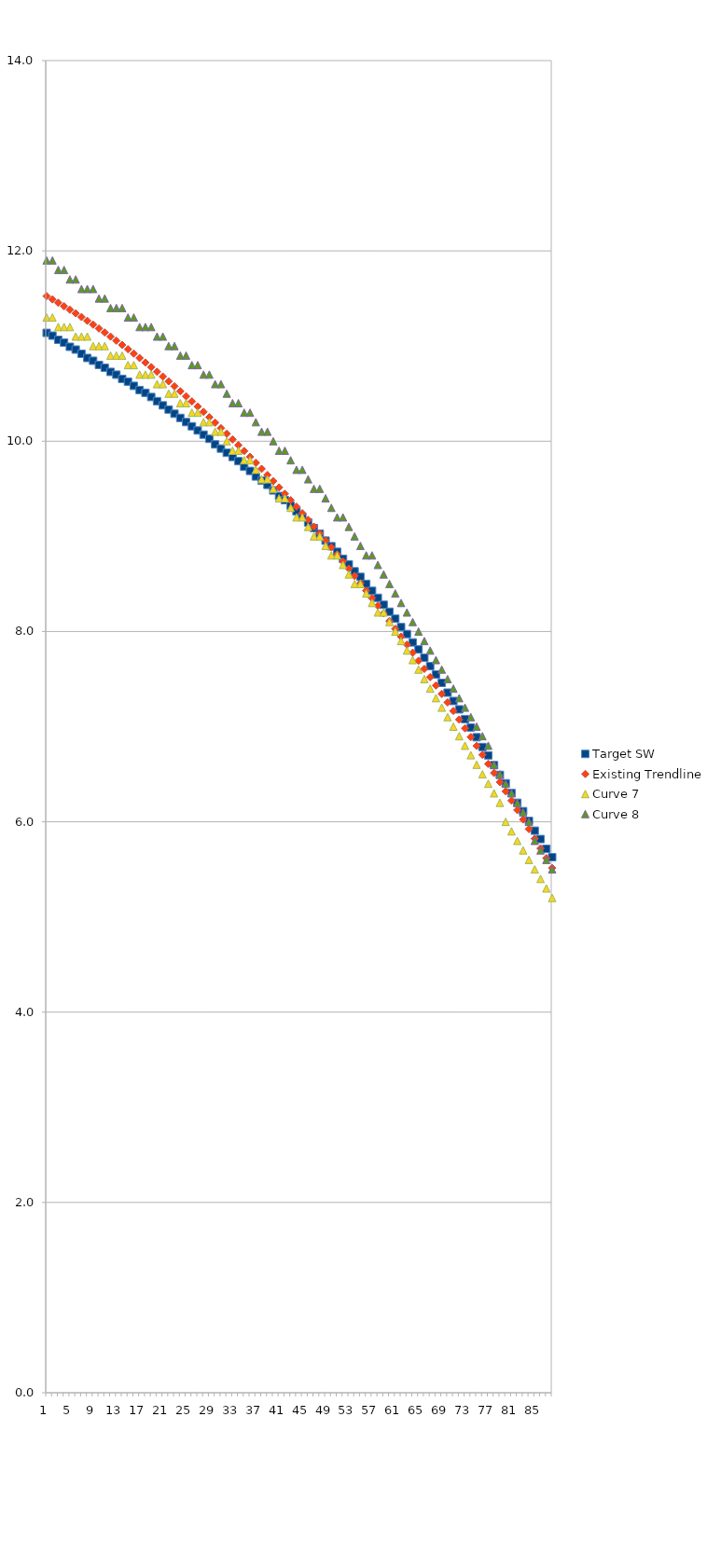
| Category | Target SW | Existing Trendline | Curve 7 | Curve 8 |
|---|---|---|---|---|
| 0 | 11.139 | 11.525 | 11.3 | 11.9 |
| 1 | 11.109 | 11.49 | 11.3 | 11.9 |
| 2 | 11.066 | 11.455 | 11.2 | 11.8 |
| 3 | 11.036 | 11.419 | 11.2 | 11.8 |
| 4 | 10.992 | 11.382 | 11.2 | 11.7 |
| 5 | 10.963 | 11.344 | 11.1 | 11.7 |
| 6 | 10.919 | 11.305 | 11.1 | 11.6 |
| 7 | 10.875 | 11.266 | 11.1 | 11.6 |
| 8 | 10.846 | 11.225 | 11 | 11.6 |
| 9 | 10.802 | 11.184 | 11 | 11.5 |
| 10 | 10.772 | 11.142 | 11 | 11.5 |
| 11 | 10.728 | 11.1 | 10.9 | 11.4 |
| 12 | 10.699 | 11.056 | 10.9 | 11.4 |
| 13 | 10.655 | 11.012 | 10.9 | 11.4 |
| 14 | 10.626 | 10.967 | 10.8 | 11.3 |
| 15 | 10.582 | 10.921 | 10.8 | 11.3 |
| 16 | 10.538 | 10.874 | 10.7 | 11.2 |
| 17 | 10.509 | 10.827 | 10.7 | 11.2 |
| 18 | 10.465 | 10.779 | 10.7 | 11.2 |
| 19 | 10.421 | 10.729 | 10.6 | 11.1 |
| 20 | 10.377 | 10.68 | 10.6 | 11.1 |
| 21 | 10.333 | 10.629 | 10.5 | 11 |
| 22 | 10.289 | 10.577 | 10.5 | 11 |
| 23 | 10.245 | 10.525 | 10.4 | 10.9 |
| 24 | 10.201 | 10.472 | 10.4 | 10.9 |
| 25 | 10.157 | 10.418 | 10.3 | 10.8 |
| 26 | 10.113 | 10.364 | 10.3 | 10.8 |
| 27 | 10.069 | 10.308 | 10.2 | 10.7 |
| 28 | 10.025 | 10.252 | 10.2 | 10.7 |
| 29 | 9.966 | 10.195 | 10.1 | 10.6 |
| 30 | 9.922 | 10.137 | 10.1 | 10.6 |
| 31 | 9.878 | 10.078 | 10 | 10.5 |
| 32 | 9.834 | 10.019 | 9.9 | 10.4 |
| 33 | 9.791 | 9.958 | 9.9 | 10.4 |
| 34 | 9.732 | 9.897 | 9.8 | 10.3 |
| 35 | 9.688 | 9.835 | 9.8 | 10.3 |
| 36 | 9.629 | 9.773 | 9.7 | 10.2 |
| 37 | 9.585 | 9.709 | 9.6 | 10.1 |
| 38 | 9.541 | 9.645 | 9.6 | 10.1 |
| 39 | 9.483 | 9.58 | 9.5 | 10 |
| 40 | 9.424 | 9.514 | 9.4 | 9.9 |
| 41 | 9.38 | 9.447 | 9.4 | 9.9 |
| 42 | 9.322 | 9.38 | 9.3 | 9.8 |
| 43 | 9.263 | 9.312 | 9.2 | 9.7 |
| 44 | 9.204 | 9.242 | 9.2 | 9.7 |
| 45 | 9.146 | 9.173 | 9.1 | 9.6 |
| 46 | 9.087 | 9.102 | 9 | 9.5 |
| 47 | 9.028 | 9.03 | 9 | 9.5 |
| 48 | 8.955 | 8.958 | 8.9 | 9.4 |
| 49 | 8.897 | 8.885 | 8.8 | 9.3 |
| 50 | 8.838 | 8.811 | 8.8 | 9.2 |
| 51 | 8.765 | 8.736 | 8.7 | 9.2 |
| 52 | 8.706 | 8.661 | 8.6 | 9.1 |
| 53 | 8.633 | 8.585 | 8.5 | 9 |
| 54 | 8.574 | 8.508 | 8.5 | 8.9 |
| 55 | 8.501 | 8.43 | 8.4 | 8.8 |
| 56 | 8.428 | 8.351 | 8.3 | 8.8 |
| 57 | 8.354 | 8.272 | 8.2 | 8.7 |
| 58 | 8.281 | 8.191 | 8.2 | 8.6 |
| 59 | 8.208 | 8.11 | 8.1 | 8.5 |
| 60 | 8.134 | 8.028 | 8 | 8.4 |
| 61 | 8.047 | 7.946 | 7.9 | 8.3 |
| 62 | 7.973 | 7.862 | 7.8 | 8.2 |
| 63 | 7.885 | 7.778 | 7.7 | 8.1 |
| 64 | 7.812 | 7.693 | 7.6 | 8 |
| 65 | 7.724 | 7.607 | 7.5 | 7.9 |
| 66 | 7.636 | 7.52 | 7.4 | 7.8 |
| 67 | 7.548 | 7.433 | 7.3 | 7.7 |
| 68 | 7.46 | 7.344 | 7.2 | 7.6 |
| 69 | 7.358 | 7.255 | 7.1 | 7.5 |
| 70 | 7.27 | 7.165 | 7 | 7.4 |
| 71 | 7.182 | 7.075 | 6.9 | 7.3 |
| 72 | 7.079 | 6.983 | 6.8 | 7.2 |
| 73 | 6.991 | 6.891 | 6.7 | 7.1 |
| 74 | 6.889 | 6.798 | 6.6 | 7 |
| 75 | 6.786 | 6.704 | 6.5 | 6.9 |
| 76 | 6.698 | 6.609 | 6.4 | 6.8 |
| 77 | 6.596 | 6.514 | 6.3 | 6.6 |
| 78 | 6.493 | 6.417 | 6.2 | 6.5 |
| 79 | 6.405 | 6.32 | 6 | 6.4 |
| 80 | 6.303 | 6.222 | 5.9 | 6.3 |
| 81 | 6.2 | 6.124 | 5.8 | 6.2 |
| 82 | 6.112 | 6.024 | 5.7 | 6.1 |
| 83 | 6.009 | 5.924 | 5.6 | 6 |
| 84 | 5.907 | 5.823 | 5.5 | 5.8 |
| 85 | 5.819 | 5.721 | 5.4 | 5.7 |
| 86 | 5.716 | 5.618 | 5.3 | 5.6 |
| 87 | 5.628 | 5.515 | 5.2 | 5.5 |